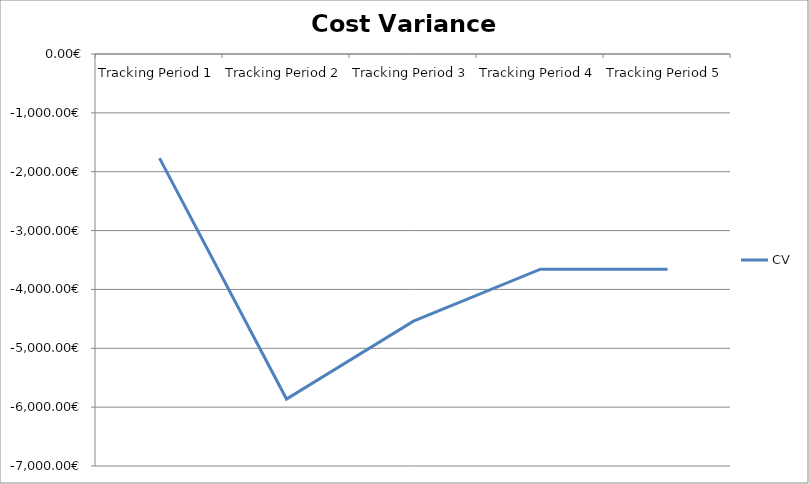
| Category | CV |
|---|---|
| Tracking Period 1 | -1769 |
| Tracking Period 2 | -5862 |
| Tracking Period 3 | -4539.78 |
| Tracking Period 4 | -3655.78 |
| Tracking Period 5 | -3655.78 |